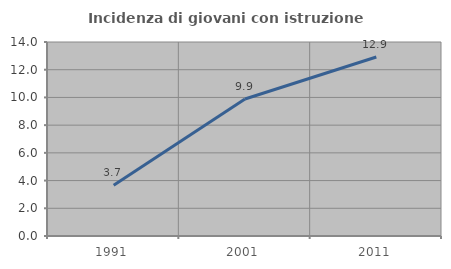
| Category | Incidenza di giovani con istruzione universitaria |
|---|---|
| 1991.0 | 3.663 |
| 2001.0 | 9.89 |
| 2011.0 | 12.919 |